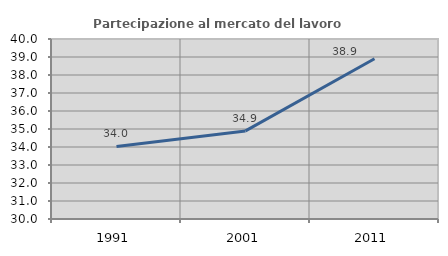
| Category | Partecipazione al mercato del lavoro  femminile |
|---|---|
| 1991.0 | 34.033 |
| 2001.0 | 34.894 |
| 2011.0 | 38.899 |